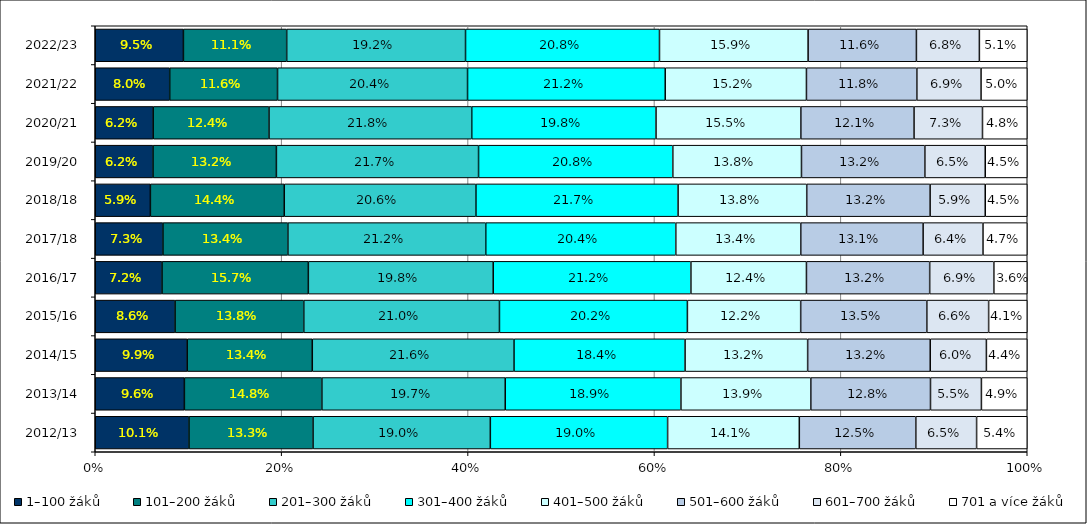
| Category | 1–100 žáků | 101–200 žáků | 201–300 žáků | 301–400 žáků | 401–500 žáků | 501–600 žáků | 601–700 žáků | 701 a více žáků |
|---|---|---|---|---|---|---|---|---|
| 2012/13 | 0.101 | 0.133 | 0.19 | 0.19 | 0.141 | 0.125 | 0.065 | 0.054 |
| 2013/14 | 0.096 | 0.148 | 0.197 | 0.189 | 0.139 | 0.128 | 0.055 | 0.049 |
| 2014/15 | 0.099 | 0.134 | 0.216 | 0.184 | 0.132 | 0.132 | 0.06 | 0.044 |
| 2015/16 | 0.086 | 0.138 | 0.21 | 0.202 | 0.122 | 0.135 | 0.066 | 0.041 |
| 2016/17 | 0.072 | 0.157 | 0.198 | 0.212 | 0.124 | 0.132 | 0.069 | 0.036 |
| 2017/18 | 0.073 | 0.134 | 0.212 | 0.204 | 0.134 | 0.131 | 0.064 | 0.047 |
| 2018/18 | 0.059 | 0.144 | 0.206 | 0.217 | 0.138 | 0.132 | 0.059 | 0.045 |
| 2019/20 | 0.062 | 0.132 | 0.217 | 0.208 | 0.138 | 0.132 | 0.065 | 0.045 |
| 2020/21 | 0.062 | 0.124 | 0.218 | 0.198 | 0.155 | 0.121 | 0.073 | 0.048 |
| 2021/22 | 0.08 | 0.116 | 0.204 | 0.212 | 0.152 | 0.118 | 0.069 | 0.05 |
| 2022/23 | 0.095 | 0.111 | 0.192 | 0.208 | 0.159 | 0.116 | 0.068 | 0.051 |